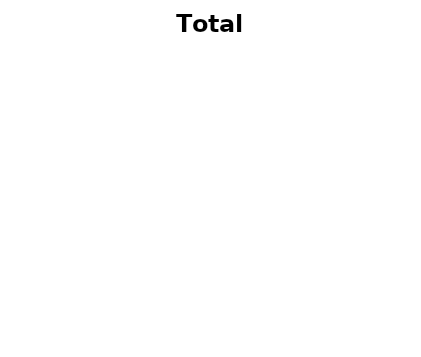
| Category | Series 0 |
|---|---|
| Material Cost | 0 |
| Equipment Cost | 0 |
| Labor Cost | 0 |